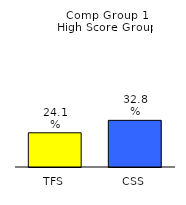
| Category | Series 0 |
|---|---|
| TFS | 0.241 |
| CSS | 0.328 |